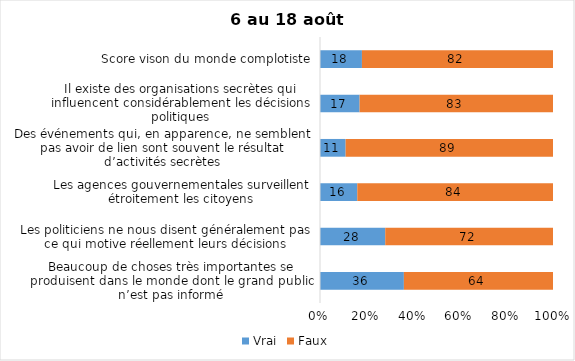
| Category | Vrai | Faux |
|---|---|---|
| Beaucoup de choses très importantes se produisent dans le monde dont le grand public n’est pas informé | 36 | 64 |
| Les politiciens ne nous disent généralement pas ce qui motive réellement leurs décisions | 28 | 72 |
| Les agences gouvernementales surveillent étroitement les citoyens | 16 | 84 |
| Des événements qui, en apparence, ne semblent pas avoir de lien sont souvent le résultat d’activités secrètes | 11 | 89 |
| Il existe des organisations secrètes qui influencent considérablement les décisions politiques | 17 | 83 |
| Score vison du monde complotiste | 18 | 82 |